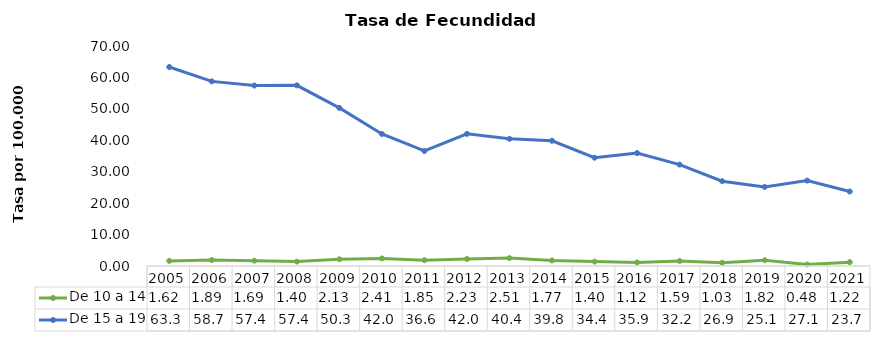
| Category | De 10 a 14  | De 15 a 19 |
|---|---|---|
| 0 | 1.624 | 63.315 |
| 1 | 1.893 | 58.742 |
| 2 | 1.689 | 57.414 |
| 3 | 1.397 | 57.479 |
| 4 | 2.135 | 50.296 |
| 5 | 2.41 | 42.011 |
| 6 | 1.854 | 36.601 |
| 7 | 2.227 | 42.042 |
| 8 | 2.507 | 40.478 |
| 9 | 1.766 | 39.839 |
| 10 | 1.396 | 34.462 |
| 11 | 1.12 | 35.933 |
| 12 | 1.59 | 32.258 |
| 13 | 1.032 | 26.987 |
| 14 | 1.823 | 25.174 |
| 15 | 0.484 | 27.173 |
| 16 | 1.22 | 23.7 |